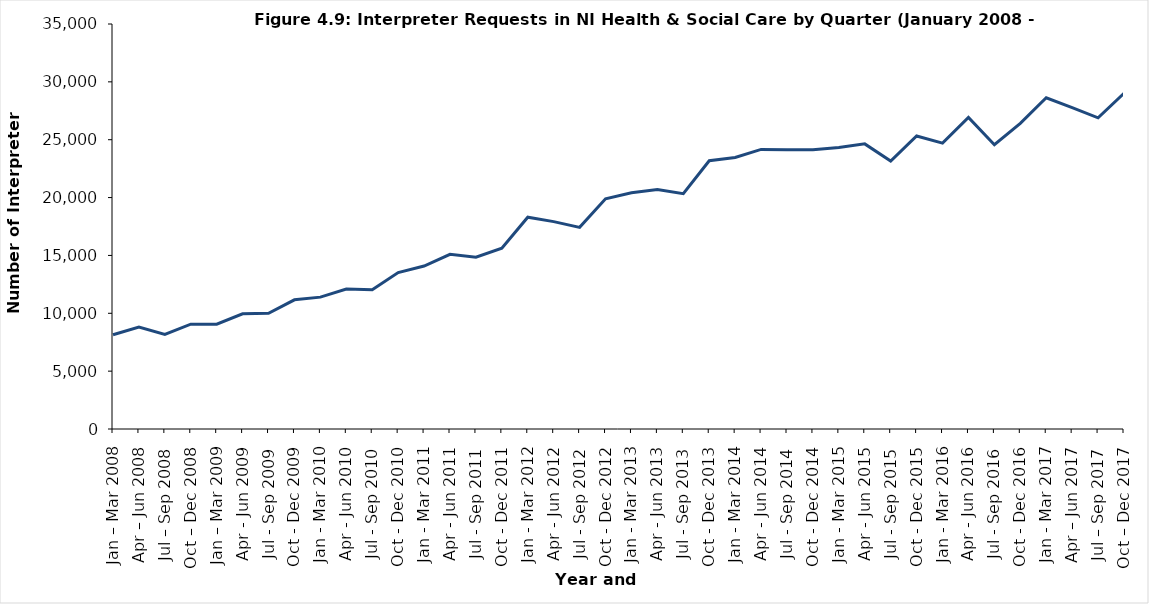
| Category | Interpreter Requests |
|---|---|
| Jan – Mar 2008 | 8140 |
| Apr – Jun 2008 | 8810 |
| Jul – Sep 2008 | 8180 |
| Oct – Dec 2008 | 9055 |
| Jan – Mar 2009 | 9060 |
| Apr - Jun 2009 | 9950 |
| Jul - Sep 2009 | 10000 |
| Oct - Dec 2009 | 11165 |
| Jan - Mar 2010 | 11395 |
| Apr - Jun 2010 | 12095 |
| Jul - Sep 2010 | 12035 |
| Oct - Dec 2010 | 13520 |
| Jan - Mar 2011 | 14085 |
| Apr - Jun 2011 | 15100 |
| Jul - Sep 2011 | 14845 |
| Oct - Dec 2011 | 15625 |
| Jan - Mar 2012 | 18300 |
| Apr - Jun 2012 | 17920 |
| Jul - Sep 2012 | 17425 |
| Oct - Dec 2012 | 19890 |
| Jan - Mar 2013 | 20410 |
| Apr - Jun 2013 | 20695 |
| Jul - Sep 2013 | 20335 |
| Oct - Dec 2013 | 23185 |
| Jan - Mar 2014 | 23470 |
| Apr - Jun 2014 | 24160 |
| Jul - Sep 2014 | 24135 |
| Oct - Dec 2014 | 24130 |
| Jan - Mar 2015 | 24325 |
| Apr - Jun 2015 | 24640 |
| Jul - Sep 2015 | 23160 |
| Oct - Dec 2015 | 25320 |
| Jan - Mar 2016 | 24705 |
| Apr - Jun 2016 | 26930 |
| Jul - Sep 2016 | 24570 |
| Oct - Dec 2016 | 26410 |
| Jan - Mar 2017 | 28625 |
| Apr – Jun 2017 | 27770 |
| Jul – Sep 2017 | 26890 |
| Oct – Dec 2017 | 29010 |